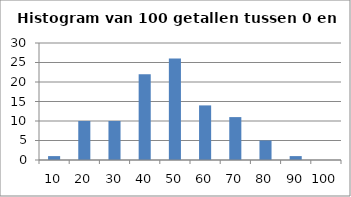
| Category | Series 0 |
|---|---|
| 10.0 | 1 |
| 20.0 | 10 |
| 30.0 | 10 |
| 40.0 | 22 |
| 50.0 | 26 |
| 60.0 | 14 |
| 70.0 | 11 |
| 80.0 | 5 |
| 90.0 | 1 |
| 100.0 | 0 |